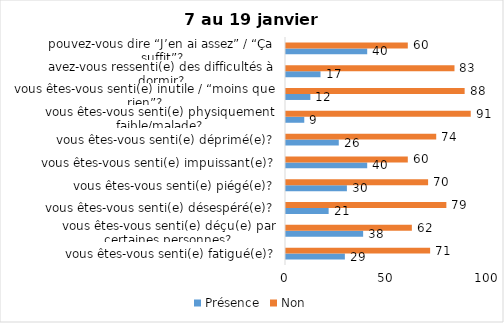
| Category | Présence | Non |
|---|---|---|
| vous êtes-vous senti(e) fatigué(e)? | 29 | 71 |
| vous êtes-vous senti(e) déçu(e) par certaines personnes? | 38 | 62 |
| vous êtes-vous senti(e) désespéré(e)? | 21 | 79 |
| vous êtes-vous senti(e) piégé(e)? | 30 | 70 |
| vous êtes-vous senti(e) impuissant(e)? | 40 | 60 |
| vous êtes-vous senti(e) déprimé(e)? | 26 | 74 |
| vous êtes-vous senti(e) physiquement faible/malade? | 9 | 91 |
| vous êtes-vous senti(e) inutile / “moins que rien”? | 12 | 88 |
| avez-vous ressenti(e) des difficultés à dormir? | 17 | 83 |
| pouvez-vous dire “J’en ai assez” / “Ça suffit”? | 40 | 60 |